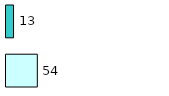
| Category | Series 0 | Series 1 |
|---|---|---|
| 0 | 54 | 13 |